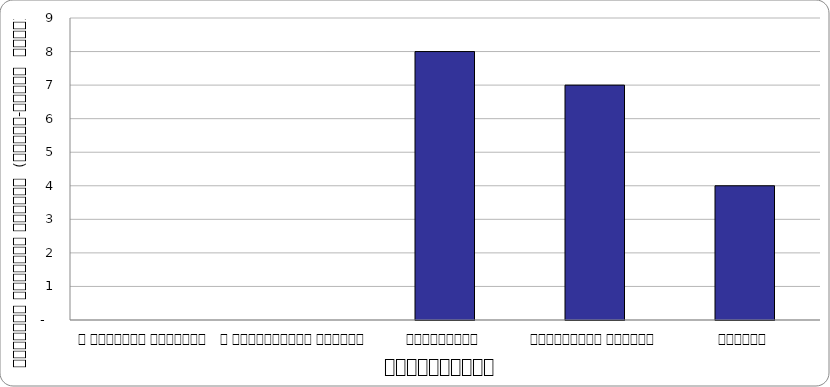
| Category | भ्रष्टाचार |
|---|---|
| द हिमालयन टाइम्स् | 0 |
| द काठमाण्डौं पोस्ट् | 0 |
| कान्तिपुर | 8 |
| अन्नपूर्ण पोस्ट् | 7 |
| नागरिक | 4 |